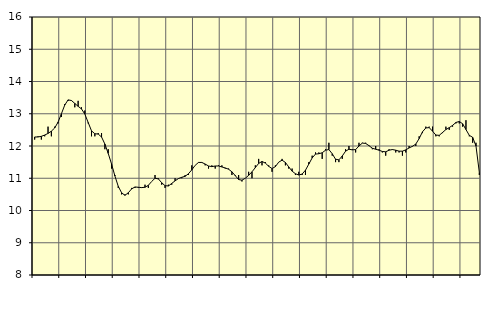
| Category | Piggar | Handel, SNI 45-47 |
|---|---|---|
| nan | 12.2 | 12.28 |
| 87.0 | 12.3 | 12.28 |
| 87.0 | 12.2 | 12.3 |
| 87.0 | 12.3 | 12.34 |
| nan | 12.6 | 12.39 |
| 88.0 | 12.3 | 12.46 |
| 88.0 | 12.6 | 12.56 |
| 88.0 | 12.7 | 12.74 |
| nan | 12.9 | 13 |
| 89.0 | 13.3 | 13.27 |
| 89.0 | 13.4 | 13.43 |
| 89.0 | 13.4 | 13.41 |
| nan | 13.2 | 13.32 |
| 90.0 | 13.4 | 13.23 |
| 90.0 | 13.2 | 13.15 |
| 90.0 | 13.1 | 12.99 |
| nan | 12.7 | 12.73 |
| 91.0 | 12.3 | 12.47 |
| 91.0 | 12.3 | 12.38 |
| 91.0 | 12.4 | 12.37 |
| nan | 12.4 | 12.28 |
| 92.0 | 11.9 | 12.06 |
| 92.0 | 11.9 | 11.77 |
| 92.0 | 11.3 | 11.44 |
| nan | 11.1 | 11.07 |
| 93.0 | 10.7 | 10.75 |
| 93.0 | 10.5 | 10.55 |
| 93.0 | 10.5 | 10.47 |
| nan | 10.5 | 10.55 |
| 94.0 | 10.7 | 10.67 |
| 94.0 | 10.7 | 10.73 |
| 94.0 | 10.7 | 10.72 |
| nan | 10.7 | 10.71 |
| 95.0 | 10.8 | 10.72 |
| 95.0 | 10.7 | 10.78 |
| 95.0 | 10.9 | 10.9 |
| nan | 11.1 | 11 |
| 96.0 | 11 | 10.98 |
| 96.0 | 10.8 | 10.86 |
| 96.0 | 10.7 | 10.77 |
| nan | 10.8 | 10.76 |
| 97.0 | 10.8 | 10.84 |
| 97.0 | 11 | 10.92 |
| 97.0 | 11 | 10.99 |
| nan | 11 | 11.03 |
| 98.0 | 11.1 | 11.06 |
| 98.0 | 11.1 | 11.14 |
| 98.0 | 11.4 | 11.26 |
| nan | 11.4 | 11.4 |
| 99.0 | 11.5 | 11.49 |
| 99.0 | 11.5 | 11.49 |
| 99.0 | 11.4 | 11.44 |
| nan | 11.3 | 11.38 |
| 0.0 | 11.4 | 11.36 |
| 0.0 | 11.3 | 11.38 |
| 0.0 | 11.4 | 11.38 |
| nan | 11.4 | 11.35 |
| 1.0 | 11.3 | 11.32 |
| 1.0 | 11.3 | 11.28 |
| 1.0 | 11.1 | 11.2 |
| nan | 11.1 | 11.08 |
| 2.0 | 11.1 | 10.96 |
| 2.0 | 10.9 | 10.94 |
| 2.0 | 11 | 11 |
| nan | 11.2 | 11.09 |
| 3.0 | 11 | 11.2 |
| 3.0 | 11.4 | 11.33 |
| 3.0 | 11.6 | 11.46 |
| nan | 11.4 | 11.52 |
| 4.0 | 11.5 | 11.47 |
| 4.0 | 11.4 | 11.37 |
| 4.0 | 11.2 | 11.3 |
| nan | 11.4 | 11.36 |
| 5.0 | 11.5 | 11.5 |
| 5.0 | 11.6 | 11.56 |
| 5.0 | 11.4 | 11.49 |
| nan | 11.3 | 11.35 |
| 6.0 | 11.3 | 11.22 |
| 6.0 | 11.1 | 11.14 |
| 6.0 | 11.2 | 11.1 |
| nan | 11.1 | 11.13 |
| 7.0 | 11.1 | 11.25 |
| 7.0 | 11.5 | 11.44 |
| 7.0 | 11.7 | 11.63 |
| nan | 11.8 | 11.75 |
| 8.0 | 11.8 | 11.76 |
| 8.0 | 11.6 | 11.79 |
| 8.0 | 11.9 | 11.87 |
| nan | 12.1 | 11.89 |
| 9.0 | 11.7 | 11.76 |
| 9.0 | 11.5 | 11.59 |
| 9.0 | 11.5 | 11.57 |
| nan | 11.6 | 11.69 |
| 10.0 | 11.9 | 11.84 |
| 10.0 | 12 | 11.9 |
| 10.0 | 11.9 | 11.88 |
| nan | 11.8 | 11.89 |
| 11.0 | 12.1 | 12 |
| 11.0 | 12.1 | 12.09 |
| 11.0 | 12.1 | 12.08 |
| nan | 12 | 12.01 |
| 12.0 | 11.9 | 11.93 |
| 12.0 | 12 | 11.9 |
| 12.0 | 11.9 | 11.87 |
| nan | 11.8 | 11.83 |
| 13.0 | 11.7 | 11.82 |
| 13.0 | 11.9 | 11.87 |
| 13.0 | 11.9 | 11.89 |
| nan | 11.8 | 11.87 |
| 14.0 | 11.8 | 11.84 |
| 14.0 | 11.7 | 11.84 |
| 14.0 | 11.8 | 11.88 |
| nan | 12 | 11.94 |
| 15.0 | 12 | 11.99 |
| 15.0 | 12 | 12.06 |
| 15.0 | 12.3 | 12.23 |
| nan | 12.4 | 12.44 |
| 16.0 | 12.6 | 12.56 |
| 16.0 | 12.6 | 12.57 |
| 16.0 | 12.6 | 12.46 |
| nan | 12.3 | 12.34 |
| 17.0 | 12.3 | 12.33 |
| 17.0 | 12.4 | 12.42 |
| 17.0 | 12.6 | 12.51 |
| nan | 12.5 | 12.57 |
| 18.0 | 12.6 | 12.64 |
| 18.0 | 12.7 | 12.73 |
| 18.0 | 12.7 | 12.76 |
| nan | 12.6 | 12.69 |
| 19.0 | 12.8 | 12.51 |
| 19.0 | 12.3 | 12.33 |
| 19.0 | 12.1 | 12.27 |
| nan | 12.1 | 12 |
| 20.0 | 11.1 | 11.18 |